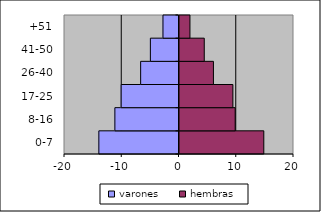
| Category | varones | hembras |
|---|---|---|
| 0-7 | -14 | 14.9 |
| 8-16 | -11.2 | 9.9 |
| 17-25 | -10.1 | 9.5 |
| 26-40 | -6.7 | 6.1 |
| 41-50 | -5 | 4.5 |
| +51 | -2.8 | 2 |